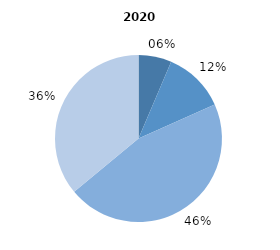
| Category | Series 0 |
|---|---|
| 0 | 6.4 |
| 1 | 11.9 |
| 2 | 45.7 |
| 3 | 36 |